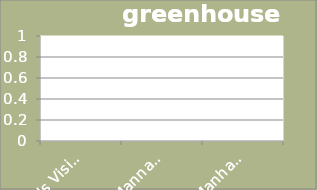
| Category | greenhouse gases |
|---|---|
| 0's Vision | 0 |
| Mannahatta (1609) | 0 |
| Manhattan (2010) | 0 |